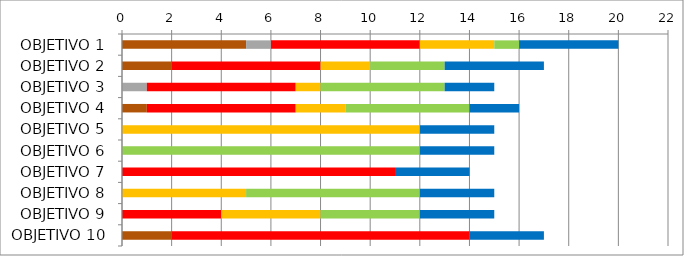
| Category | Series 0 | Series 1 | Series 2 | Series 3 | Series 4 | Series 5 |
|---|---|---|---|---|---|---|
| OBJETIVO 1 | 5 | 1 | 6 | 3 | 1 | 4 |
| OBJETIVO 2 | 2 | 0 | 6 | 2 | 3 | 4 |
| OBJETIVO 3 | 0 | 1 | 6 | 1 | 5 | 2 |
| OBJETIVO 4 | 1 | 0 | 6 | 2 | 5 | 2 |
| OBJETIVO 5 | 0 | 0 | 0 | 12 | 0 | 3 |
| OBJETIVO 6 | 0 | 0 | 0 | 0 | 12 | 3 |
| OBJETIVO 7 | 0 | 0 | 11 | 0 | 0 | 3 |
| OBJETIVO 8 | 0 | 0 | 0 | 5 | 7 | 3 |
| OBJETIVO 9 | 0 | 0 | 4 | 4 | 4 | 3 |
| OBJETIVO 10 | 2 | 0 | 12 | 0 | 0 | 3 |